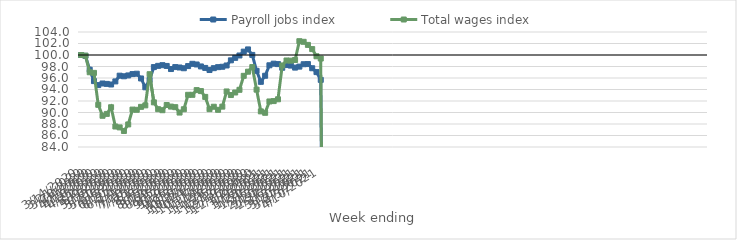
| Category | Payroll jobs index | Total wages index |
|---|---|---|
| 14/03/2020 | 100 | 100 |
| 21/03/2020 | 99.852 | 99.887 |
| 28/03/2020 | 97.442 | 96.999 |
| 04/04/2020 | 95.46 | 96.889 |
| 11/04/2020 | 94.767 | 91.337 |
| 18/04/2020 | 95.044 | 89.43 |
| 25/04/2020 | 94.973 | 89.757 |
| 02/05/2020 | 94.87 | 90.913 |
| 09/05/2020 | 95.406 | 87.56 |
| 16/05/2020 | 96.404 | 87.408 |
| 23/05/2020 | 96.301 | 86.786 |
| 30/05/2020 | 96.448 | 87.925 |
| 06/06/2020 | 96.68 | 90.508 |
| 13/06/2020 | 96.742 | 90.47 |
| 20/06/2020 | 95.919 | 90.981 |
| 27/06/2020 | 94.385 | 91.241 |
| 04/07/2020 | 95.664 | 96.661 |
| 11/07/2020 | 97.898 | 91.765 |
| 18/07/2020 | 98.112 | 90.574 |
| 25/07/2020 | 98.23 | 90.399 |
| 01/08/2020 | 98.097 | 91.3 |
| 08/08/2020 | 97.558 | 91.027 |
| 15/08/2020 | 97.897 | 90.929 |
| 22/08/2020 | 97.826 | 89.989 |
| 29/08/2020 | 97.697 | 90.564 |
| 05/09/2020 | 98.072 | 93.078 |
| 12/09/2020 | 98.465 | 93.075 |
| 19/09/2020 | 98.351 | 93.896 |
| 26/09/2020 | 98.008 | 93.725 |
| 03/10/2020 | 97.752 | 92.715 |
| 10/10/2020 | 97.386 | 90.582 |
| 17/10/2020 | 97.711 | 91.002 |
| 24/10/2020 | 97.887 | 90.468 |
| 31/10/2020 | 97.954 | 91.02 |
| 07/11/2020 | 98.177 | 93.66 |
| 14/11/2020 | 99.072 | 93.037 |
| 21/11/2020 | 99.505 | 93.477 |
| 28/11/2020 | 99.916 | 93.947 |
| 05/12/2020 | 100.586 | 96.378 |
| 12/12/2020 | 100.971 | 97.096 |
| 19/12/2020 | 100.016 | 97.897 |
| 26/12/2020 | 97.245 | 93.976 |
| 02/01/2021 | 95.334 | 90.194 |
| 09/01/2021 | 96.391 | 89.947 |
| 16/01/2021 | 98.211 | 91.92 |
| 23/01/2021 | 98.493 | 91.984 |
| 30/01/2021 | 98.417 | 92.297 |
| 06/02/2021 | 97.782 | 98.18 |
| 13/02/2021 | 98.251 | 99.048 |
| 20/02/2021 | 98.16 | 99.017 |
| 27/02/2021 | 97.808 | 99.133 |
| 06/03/2021 | 97.98 | 102.402 |
| 13/03/2021 | 98.395 | 102.295 |
| 20/03/2021 | 98.422 | 101.757 |
| 27/03/2021 | 97.698 | 101.025 |
| 03/04/2021 | 97.026 | 99.779 |
| 10/04/2021 | 95.674 | 99.385 |